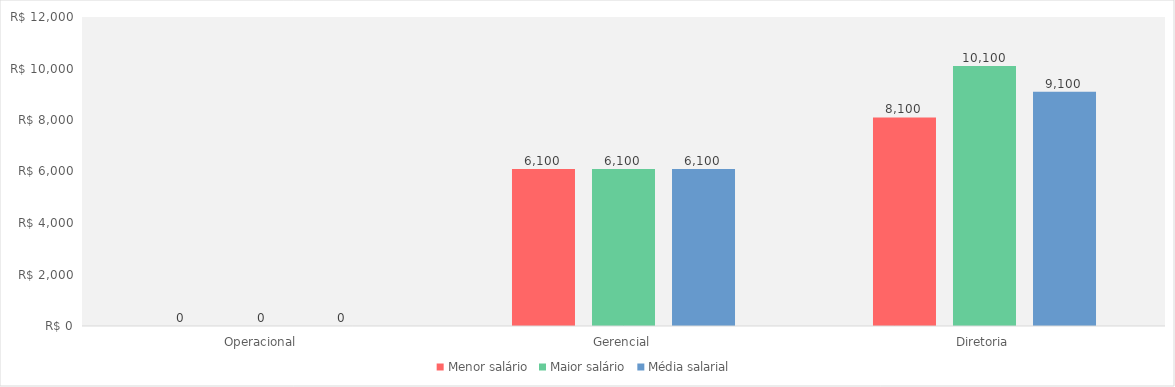
| Category | Menor salário | Maior salário | Média salarial |
|---|---|---|---|
| Operacional | 0 | 0 | 0 |
| Gerencial | 6100 | 6100 | 6100 |
| Diretoria | 8100 | 10100 | 9100 |